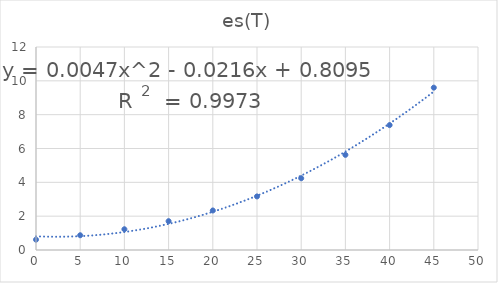
| Category | es(T) |
|---|---|
| 0.0 | 0.611 |
| 5.0 | 0.872 |
| 10.0 | 1.227 |
| 15.0 | 1.704 |
| 20.0 | 2.336 |
| 25.0 | 3.166 |
| 30.0 | 4.242 |
| 35.0 | 5.624 |
| 40.0 | 7.382 |
| 45.0 | 9.597 |